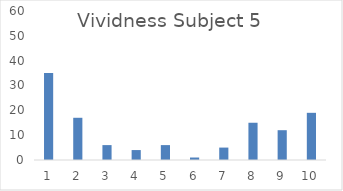
| Category | Series 0 |
|---|---|
| 0 | 35 |
| 1 | 17 |
| 2 | 6 |
| 3 | 4 |
| 4 | 6 |
| 5 | 1 |
| 6 | 5 |
| 7 | 15 |
| 8 | 12 |
| 9 | 19 |